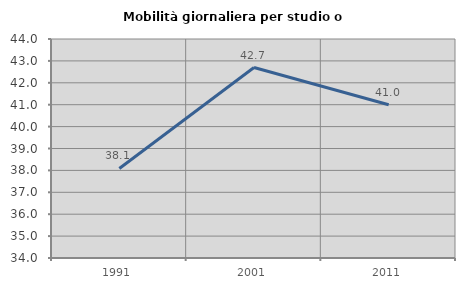
| Category | Mobilità giornaliera per studio o lavoro |
|---|---|
| 1991.0 | 38.088 |
| 2001.0 | 42.696 |
| 2011.0 | 40.998 |